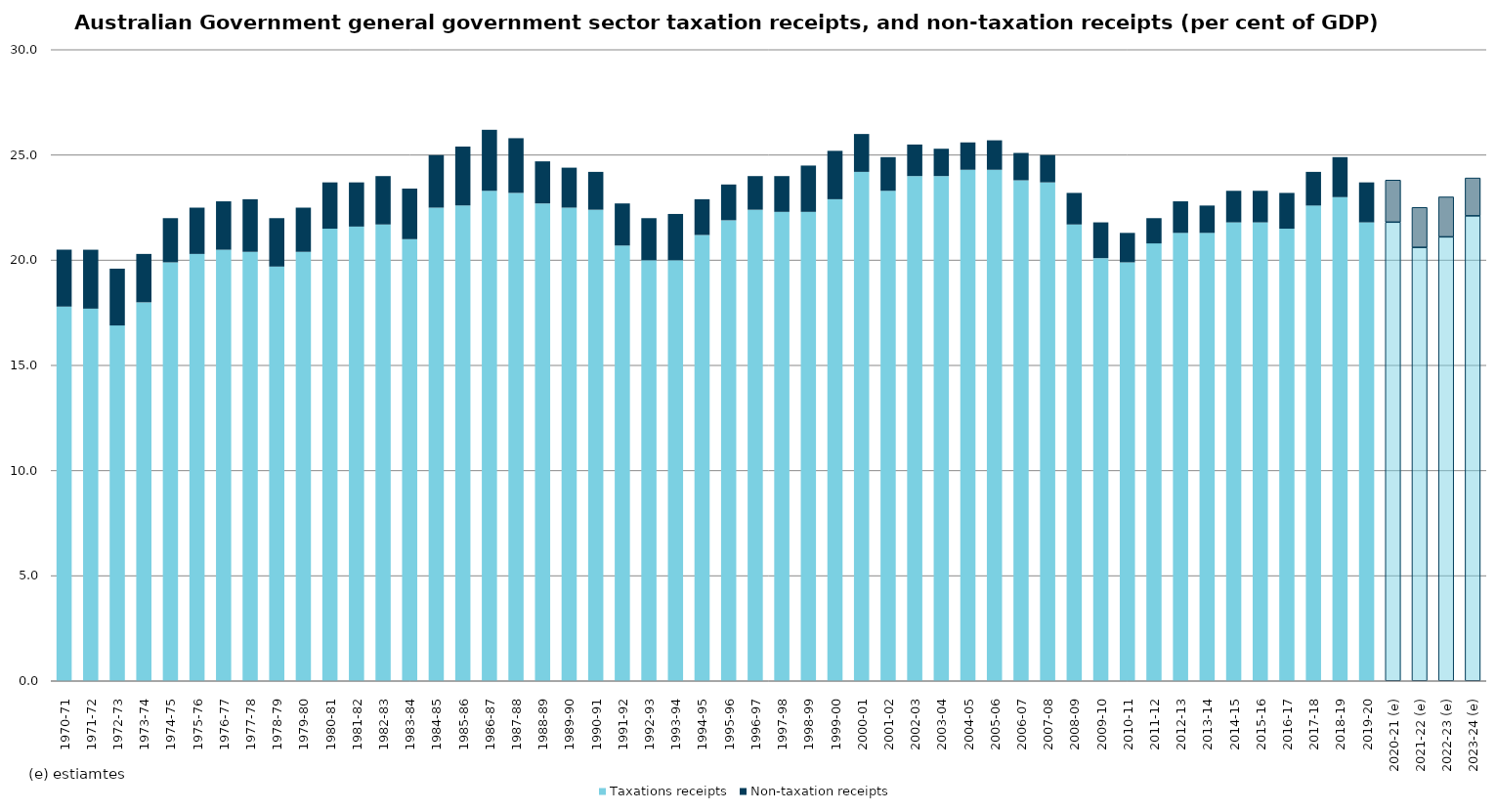
| Category | Taxations receipts | Non-taxation receipts |
|---|---|---|
| 1970-71 | 17.8 | 2.7 |
| 1971-72 | 17.7 | 2.8 |
| 1972-73 | 16.9 | 2.7 |
| 1973-74 | 18 | 2.3 |
| 1974-75 | 19.9 | 2.1 |
| 1975-76 | 20.3 | 2.2 |
| 1976-77 | 20.5 | 2.3 |
| 1977-78 | 20.4 | 2.5 |
| 1978-79 | 19.7 | 2.3 |
| 1979-80 | 20.4 | 2.1 |
| 1980-81 | 21.5 | 2.2 |
| 1981-82 | 21.6 | 2.1 |
| 1982-83 | 21.7 | 2.3 |
| 1983-84 | 21 | 2.4 |
| 1984-85 | 22.5 | 2.5 |
| 1985-86 | 22.6 | 2.8 |
| 1986-87 | 23.3 | 2.9 |
| 1987-88 | 23.2 | 2.6 |
| 1988-89 | 22.7 | 2 |
| 1989-90 | 22.5 | 1.9 |
| 1990-91 | 22.4 | 1.8 |
| 1991-92 | 20.7 | 2 |
| 1992-93 | 20 | 2 |
| 1993-94 | 20 | 2.2 |
| 1994-95 | 21.2 | 1.7 |
| 1995-96 | 21.9 | 1.7 |
| 1996-97 | 22.4 | 1.6 |
| 1997-98 | 22.3 | 1.7 |
| 1998-99 | 22.3 | 2.2 |
| 1999-00 | 22.9 | 2.3 |
| 2000-01 | 24.2 | 1.8 |
| 2001-02 | 23.3 | 1.6 |
| 2002-03 | 24 | 1.5 |
| 2003-04 | 24 | 1.3 |
| 2004-05 | 24.3 | 1.3 |
| 2005-06 | 24.3 | 1.4 |
| 2006-07 | 23.8 | 1.3 |
| 2007-08 | 23.7 | 1.3 |
| 2008-09 | 21.7 | 1.5 |
| 2009-10 | 20.1 | 1.7 |
| 2010-11 | 19.9 | 1.4 |
| 2011-12 | 20.8 | 1.2 |
| 2012-13 | 21.3 | 1.5 |
| 2013-14 | 21.3 | 1.3 |
| 2014-15 | 21.8 | 1.5 |
| 2015-16 | 21.8 | 1.5 |
| 2016-17 | 21.5 | 1.7 |
| 2017-18 | 22.6 | 1.6 |
| 2018-19 | 23 | 1.9 |
| 2019-20 | 21.8 | 1.9 |
| 2020-21 (e) | 21.8 | 2 |
| 2021-22 (e) | 20.6 | 1.9 |
| 2022-23 (e) | 21.1 | 1.9 |
| 2023-24 (e) | 22.1 | 1.8 |